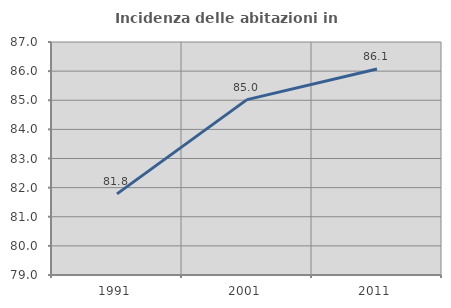
| Category | Incidenza delle abitazioni in proprietà  |
|---|---|
| 1991.0 | 81.786 |
| 2001.0 | 85.022 |
| 2011.0 | 86.072 |